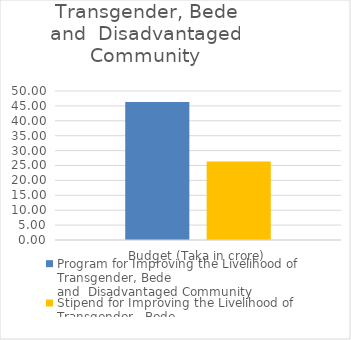
| Category | Program for Improving the Livelihood of  Transgender, Bede
and  Disadvantaged Community | Stipend for Improving the Livelihood of  Transgender,  Bede
and Disadvantaged Community |
|---|---|---|
| Budget (Taka in crore) | 46.31 | 26.35 |